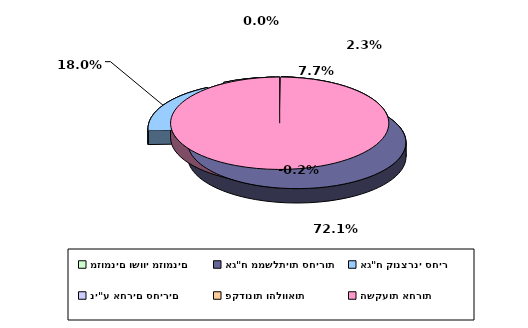
| Category | Series 0 |
|---|---|
| מזומנים ושווי מזומנים | 0.023 |
| אג"ח ממשלתיות סחירות | 0.721 |
| אג"ח קונצרני סחיר | 0.18 |
| ני"ע אחרים סחירים | 0.077 |
| פקדונות והלוואות | 0 |
| השקעות אחרות | -0.002 |